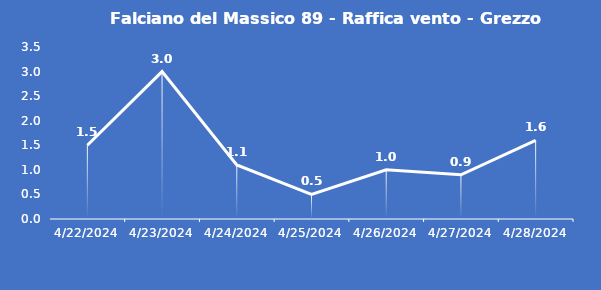
| Category | Falciano del Massico 89 - Raffica vento - Grezzo (m/s) |
|---|---|
| 4/22/24 | 1.5 |
| 4/23/24 | 3 |
| 4/24/24 | 1.1 |
| 4/25/24 | 0.5 |
| 4/26/24 | 1 |
| 4/27/24 | 0.9 |
| 4/28/24 | 1.6 |